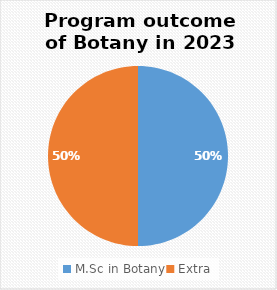
| Category | Series 0 |
|---|---|
| M.Sc in Botany | 6 |
| Extra | 6 |